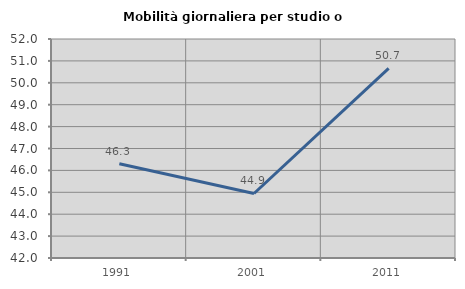
| Category | Mobilità giornaliera per studio o lavoro |
|---|---|
| 1991.0 | 46.307 |
| 2001.0 | 44.946 |
| 2011.0 | 50.66 |